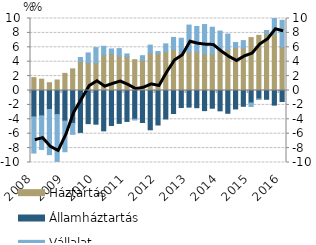
| Category | Háztartás | Államháztartás | Vállalat |
|---|---|---|---|
| 2008.0 | 1.791 | -3.669 | -5.019 |
| 2008.0 | 1.574 | -3.518 | -4.676 |
| 2008.0 | 1.081 | -2.64 | -6.274 |
| 2008.0 | 1.459 | -3.345 | -6.503 |
| 2009.0 | 2.38 | -4.248 | -4.257 |
| 2009.0 | 3.007 | -4.562 | -1.527 |
| 2009.0 | 4.011 | -5.819 | 0.569 |
| 2009.0 | 3.839 | -4.604 | 1.381 |
| 2010.0 | 3.83 | -4.678 | 2.127 |
| 2010.0 | 4.907 | -5.606 | 1.232 |
| 2010.0 | 5.126 | -4.857 | 0.641 |
| 2010.0 | 4.805 | -4.571 | 1.011 |
| 2011.0 | 4.72 | -4.297 | 0.358 |
| 2011.0 | 4.281 | -3.98 | -0.122 |
| 2011.0 | 4.226 | -4.449 | 0.61 |
| 2011.0 | 5.218 | -5.457 | 1.083 |
| 2012.0 | 5.142 | -4.79 | 0.281 |
| 2012.0 | 5.346 | -3.958 | 1.128 |
| 2012.0 | 5.699 | -3.195 | 1.675 |
| 2012.0 | 5.28 | -2.368 | 1.982 |
| 2013.0 | 5.338 | -2.309 | 3.747 |
| 2013.0 | 5.38 | -2.391 | 3.508 |
| 2013.0 | 5.068 | -2.797 | 4.091 |
| 2013.0 | 5.05 | -2.461 | 3.737 |
| 2014.0 | 5.506 | -2.825 | 2.751 |
| 2014.0 | 5.676 | -3.162 | 2.166 |
| 2014.0 | 5.946 | -2.562 | 0.718 |
| 2014.0 | 5.898 | -2.19 | 1.031 |
| 2015.0 | 7.351 | -1.729 | -0.495 |
| 2015.0 | 7.658 | -1.174 | -0.076 |
| 2015.0 | 7.867 | -1.217 | 0.472 |
| 2015.0 | 7.826 | -2.029 | 2.703 |
| 2016.0 | 6.066 | -1.527 | 3.682 |